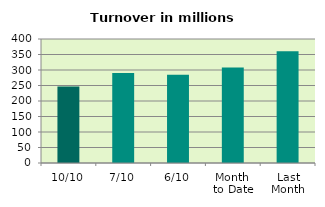
| Category | Series 0 |
|---|---|
| 10/10 | 246.522 |
| 7/10 | 290.671 |
| 6/10 | 284.956 |
| Month 
to Date | 307.908 |
| Last
Month | 360.198 |